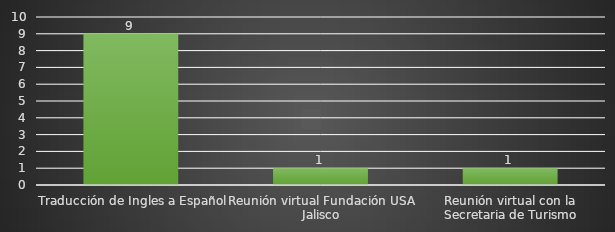
| Category | INDICADOR  |
|---|---|
| Traducción de Ingles a Español | 9 |
| Reunión virtual Fundación USA Jalisco | 1 |
| Reunión virtual con la Secretaria de Turismo | 1 |